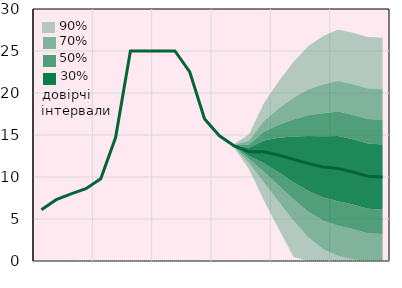
| Category | Облікова ставка, % |
|---|---|
|  | 6.1 |
|  | 7.3 |
|  | 8 |
| IV.21 | 8.6 |
|  | 9.8 |
|  | 14.7 |
|  | 25 |
| IV.22 | 25 |
|  | 25 |
|  | 25 |
|  | 22.5 |
| IV.23 | 16.9 |
|  | 14.9 |
|  | 13.7 |
|  | 13 |
| IV.24 | 13 |
|  | 12.6 |
|  | 12.1 |
|  | 11.6 |
| IV.25 | 11.2 |
|  | 11 |
|  | 10.6 |
|  | 10.1 |
| IV.26 | 10 |